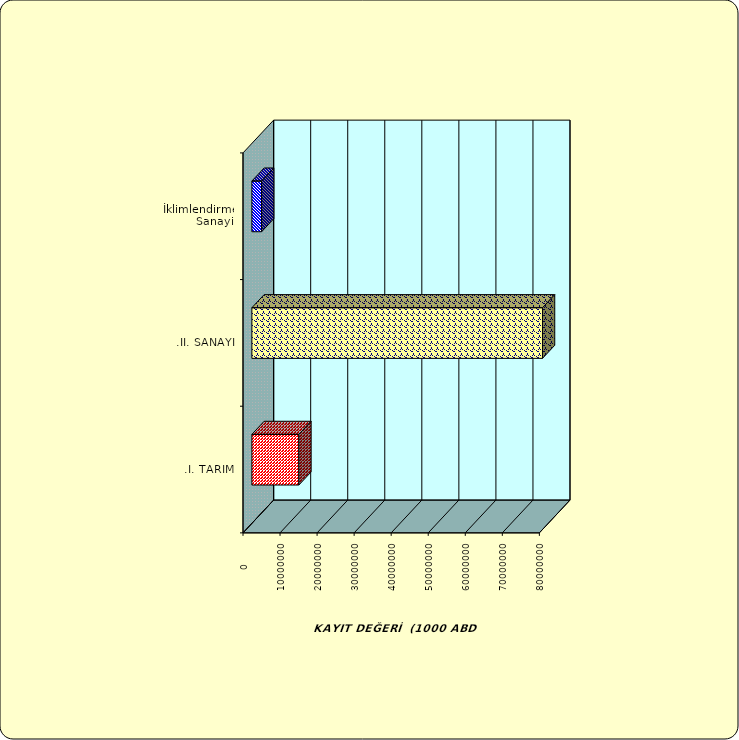
| Category | Series 0 |
|---|---|
| .I. TARIM | 12683703.887 |
| .II. SANAYİ | 78451490.289 |
|  İklimlendirme Sanayii | 2632791.396 |